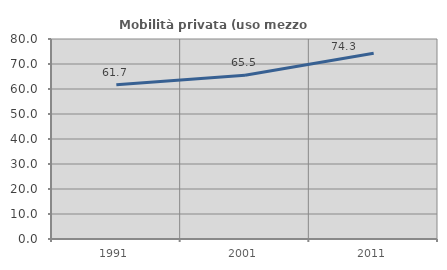
| Category | Mobilità privata (uso mezzo privato) |
|---|---|
| 1991.0 | 61.682 |
| 2001.0 | 65.531 |
| 2011.0 | 74.327 |